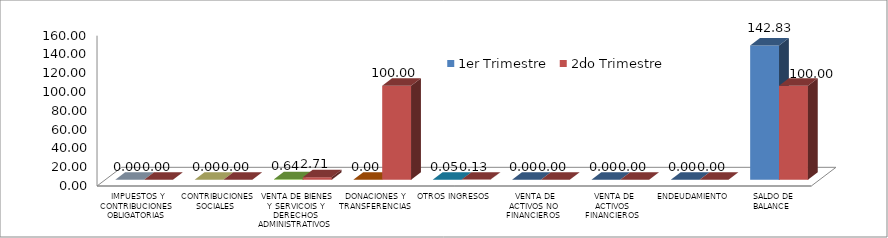
| Category | 1er Trimestre | 2do Trimestre |
|---|---|---|
|  IMPUESTOS Y CONTRIBUCIONES OBLIGATORIAS | 0 | 0 |
|  CONTRIBUCIONES SOCIALES | 0 | 0 |
|  VENTA DE BIENES Y SERVICOIS Y DERECHOS ADMINISTRATIVOS | 0.641 | 2.709 |
|  DONACIONES Y TRANSFERENCIAS | 0 | 100 |
|  OTROS INGRESOS | 0.048 | 0.134 |
|  VENTA DE ACTIVOS NO FINANCIEROS | 0 | 0 |
|  VENTA DE ACTIVOS FINANCIEROS | 0 | 0 |
|  ENDEUDAMIENTO | 0 | 0 |
|  SALDO DE BALANCE | 142.834 | 100 |